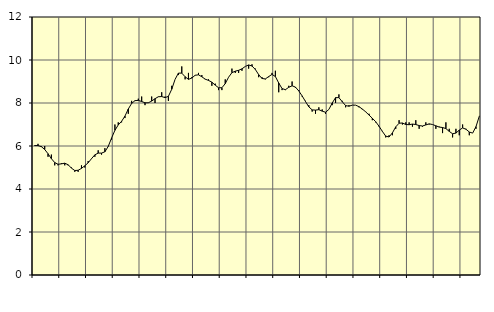
| Category | Piggar | Series 1 |
|---|---|---|
| nan | 6 | 6.02 |
| 87.0 | 6.1 | 6.02 |
| 87.0 | 6 | 5.97 |
| 87.0 | 6 | 5.84 |
| nan | 5.5 | 5.64 |
| 88.0 | 5.6 | 5.41 |
| 88.0 | 5.1 | 5.23 |
| 88.0 | 5.1 | 5.15 |
| nan | 5.2 | 5.17 |
| 89.0 | 5.1 | 5.2 |
| 89.0 | 5.1 | 5.13 |
| 89.0 | 5 | 4.97 |
| nan | 4.8 | 4.86 |
| 90.0 | 4.8 | 4.87 |
| 90.0 | 5.1 | 4.96 |
| 90.0 | 5 | 5.08 |
| nan | 5.3 | 5.22 |
| 91.0 | 5.4 | 5.41 |
| 91.0 | 5.5 | 5.59 |
| 91.0 | 5.8 | 5.67 |
| nan | 5.6 | 5.67 |
| 92.0 | 5.9 | 5.73 |
| 92.0 | 6 | 5.98 |
| 92.0 | 6.3 | 6.37 |
| nan | 7 | 6.73 |
| 93.0 | 7.1 | 6.98 |
| 93.0 | 7.1 | 7.15 |
| 93.0 | 7.3 | 7.39 |
| nan | 7.5 | 7.72 |
| 94.0 | 8.1 | 7.98 |
| 94.0 | 8.1 | 8.11 |
| 94.0 | 8.2 | 8.12 |
| nan | 8.3 | 8.07 |
| 95.0 | 7.9 | 8.01 |
| 95.0 | 8 | 8.01 |
| 95.0 | 8.3 | 8.09 |
| nan | 8 | 8.2 |
| 96.0 | 8.3 | 8.29 |
| 96.0 | 8.5 | 8.3 |
| 96.0 | 8.3 | 8.25 |
| nan | 8.1 | 8.31 |
| 97.0 | 8.8 | 8.64 |
| 97.0 | 9.1 | 9.1 |
| 97.0 | 9.3 | 9.39 |
| nan | 9.7 | 9.39 |
| 98.0 | 9.1 | 9.22 |
| 98.0 | 9.4 | 9.1 |
| 98.0 | 9.2 | 9.16 |
| nan | 9.3 | 9.29 |
| 99.0 | 9.4 | 9.31 |
| 99.0 | 9.3 | 9.22 |
| 99.0 | 9.1 | 9.11 |
| nan | 9.1 | 9.05 |
| 0.0 | 8.8 | 8.97 |
| 0.0 | 8.9 | 8.83 |
| 0.0 | 8.6 | 8.71 |
| nan | 8.6 | 8.71 |
| 1.0 | 9.1 | 8.9 |
| 1.0 | 9.2 | 9.2 |
| 1.0 | 9.6 | 9.41 |
| nan | 9.4 | 9.48 |
| 2.0 | 9.4 | 9.52 |
| 2.0 | 9.5 | 9.59 |
| 2.0 | 9.7 | 9.7 |
| nan | 9.6 | 9.77 |
| 3.0 | 9.8 | 9.72 |
| 3.0 | 9.6 | 9.56 |
| 3.0 | 9.2 | 9.32 |
| nan | 9.2 | 9.14 |
| 4.0 | 9.1 | 9.12 |
| 4.0 | 9.2 | 9.23 |
| 4.0 | 9.4 | 9.33 |
| nan | 9.5 | 9.23 |
| 5.0 | 8.5 | 8.93 |
| 5.0 | 8.6 | 8.67 |
| 5.0 | 8.6 | 8.62 |
| nan | 8.8 | 8.73 |
| 6.0 | 9 | 8.8 |
| 6.0 | 8.7 | 8.74 |
| 6.0 | 8.6 | 8.56 |
| nan | 8.3 | 8.33 |
| 7.0 | 8.1 | 8.07 |
| 7.0 | 7.9 | 7.82 |
| 7.0 | 7.6 | 7.68 |
| nan | 7.5 | 7.67 |
| 8.0 | 7.8 | 7.69 |
| 8.0 | 7.7 | 7.62 |
| 8.0 | 7.5 | 7.57 |
| nan | 7.7 | 7.7 |
| 9.0 | 7.9 | 8 |
| 9.0 | 8 | 8.25 |
| 9.0 | 8.4 | 8.25 |
| nan | 8.1 | 8.06 |
| 10.0 | 7.8 | 7.88 |
| 10.0 | 7.9 | 7.85 |
| 10.0 | 7.9 | 7.9 |
| nan | 7.9 | 7.9 |
| 11.0 | 7.8 | 7.83 |
| 11.0 | 7.7 | 7.72 |
| 11.0 | 7.6 | 7.59 |
| nan | 7.5 | 7.44 |
| 12.0 | 7.2 | 7.29 |
| 12.0 | 7.1 | 7.13 |
| 12.0 | 6.9 | 6.92 |
| nan | 6.7 | 6.68 |
| 13.0 | 6.4 | 6.46 |
| 13.0 | 6.5 | 6.42 |
| 13.0 | 6.5 | 6.61 |
| nan | 6.8 | 6.89 |
| 14.0 | 7.2 | 7.06 |
| 14.0 | 7 | 7.07 |
| 14.0 | 7.1 | 7 |
| nan | 7.1 | 6.99 |
| 15.0 | 6.9 | 7.02 |
| 15.0 | 7.2 | 7 |
| 15.0 | 6.8 | 6.95 |
| nan | 6.9 | 6.93 |
| 16.0 | 7.1 | 6.98 |
| 16.0 | 7 | 7.03 |
| 16.0 | 7 | 7 |
| nan | 6.8 | 6.94 |
| 17.0 | 6.9 | 6.88 |
| 17.0 | 6.6 | 6.86 |
| 17.0 | 7.1 | 6.81 |
| nan | 6.8 | 6.68 |
| 18.0 | 6.4 | 6.57 |
| 18.0 | 6.8 | 6.6 |
| 18.0 | 6.5 | 6.74 |
| nan | 7 | 6.84 |
| 19.0 | 6.8 | 6.78 |
| 19.0 | 6.5 | 6.65 |
| 19.0 | 6.6 | 6.6 |
| nan | 6.8 | 6.9 |
| 20.0 | 7.4 | 7.39 |